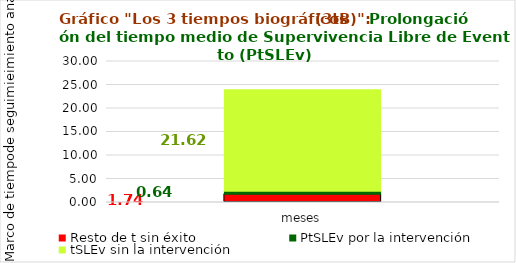
| Category | Resto de t sin éxito | PtSLEv por la intervención | tSLEv sin la intervención |
|---|---|---|---|
| meses | 1.74 | 0.641 | 21.619 |